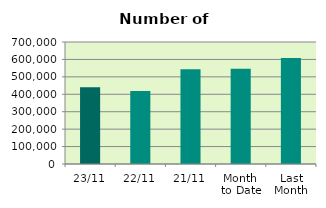
| Category | Series 0 |
|---|---|
| 23/11 | 440606 |
| 22/11 | 419186 |
| 21/11 | 543878 |
| Month 
to Date | 545912.588 |
| Last
Month | 607838.609 |